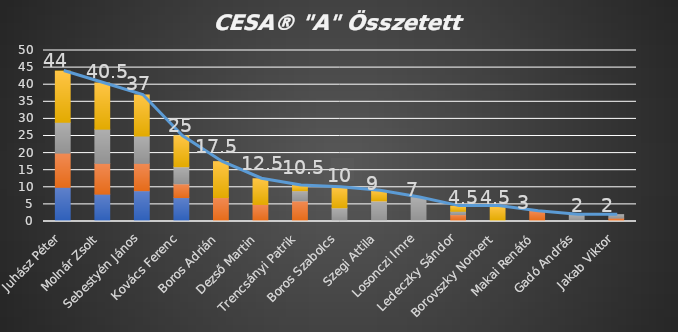
| Category | 1. liga | 2. liga | 3. liga | 4. liga |
|---|---|---|---|---|
| Juhász Péter | 10 | 10 | 9 | 15 |
| Molnár Zsolt | 8 | 9 | 10 | 13.5 |
| Sebestyén János | 9 | 8 | 8 | 12 |
| Kovács Ferenc | 7 | 4 | 5 | 9 |
| Boros Adrián | 0 | 7 | 0 | 10.5 |
| Dezső Martin | 0 | 5 | 0 | 7.5 |
| Trencsányi Patrik | 0 | 6 | 3 | 1.5 |
| Boros Szabolcs | 0 | 0 | 4 | 6 |
| Szegi Attila | 0 | 0 | 6 | 3 |
| Losonczi Imre | 0 | 0 | 7 | 0 |
| Ledeczky Sándor | 0 | 2 | 1 | 1.5 |
| Borovszky Norbert | 0 | 0 | 0 | 4.5 |
| Makai Renátó | 0 | 3 | 0 | 0 |
| Gadó András | 0 | 0 | 2 | 0 |
| Jakab Viktor | 0 | 1 | 1 | 0 |